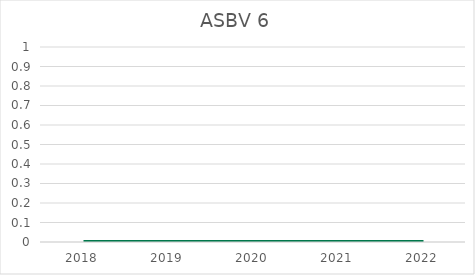
| Category | ASBV 6 |
|---|---|
| 2018.0 | 0 |
| 2019.0 | 0 |
| 2020.0 | 0 |
| 2021.0 | 0 |
| 2022.0 | 0 |